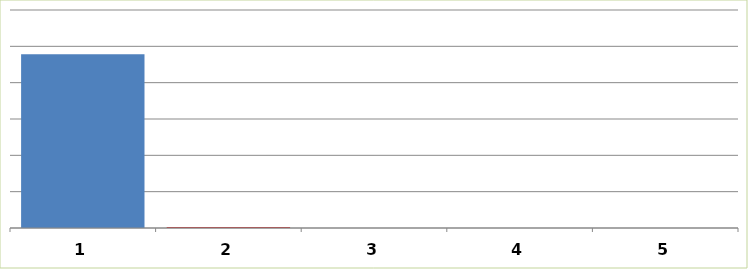
| Category | Series 0 |
|---|---|
| 0 | 2391500 |
| 1 | 11000 |
| 2 | 0 |
| 3 | 0 |
| 4 | 0 |